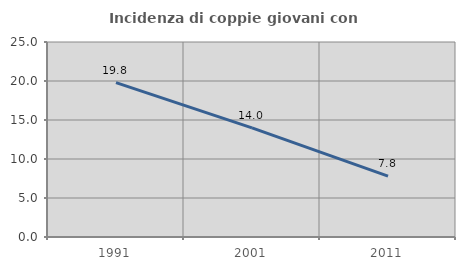
| Category | Incidenza di coppie giovani con figli |
|---|---|
| 1991.0 | 19.786 |
| 2001.0 | 13.997 |
| 2011.0 | 7.794 |